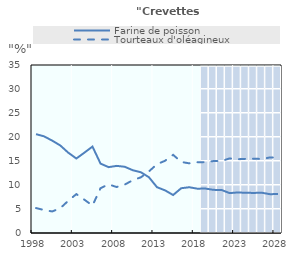
| Category | Projected1 | Projected2 | Projected3 | Projected4 | Projected5 | Projected6 | Projected7 |
|---|---|---|---|---|---|---|---|
| 1998.0 | 0 | 0 | 0 | 0 | 0 | 0 | 0 |
| 1999.0 | 0 | 0 | 0 | 0 | 0 | 0 | 0 |
| 2000.0 | 0 | 0 | 0 | 0 | 0 | 0 | 0 |
| 2001.0 | 0 | 0 | 0 | 0 | 0 | 0 | 0 |
| 2002.0 | 0 | 0 | 0 | 0 | 0 | 0 | 0 |
| 2003.0 | 0 | 0 | 0 | 0 | 0 | 0 | 0 |
| 2004.0 | 0 | 0 | 0 | 0 | 0 | 0 | 0 |
| 2005.0 | 0 | 0 | 0 | 0 | 0 | 0 | 0 |
| 2006.0 | 0 | 0 | 0 | 0 | 0 | 0 | 0 |
| 2007.0 | 0 | 0 | 0 | 0 | 0 | 0 | 0 |
| 2008.0 | 0 | 0 | 0 | 0 | 0 | 0 | 0 |
| 2009.0 | 0 | 0 | 0 | 0 | 0 | 0 | 0 |
| 2010.0 | 0 | 0 | 0 | 0 | 0 | 0 | 0 |
| 2011.0 | 0 | 0 | 0 | 0 | 0 | 0 | 0 |
| 2012.0 | 0 | 0 | 0 | 0 | 0 | 0 | 0 |
| 2013.0 | 0 | 0 | 0 | 0 | 0 | 0 | 0 |
| 2014.0 | 0 | 0 | 0 | 0 | 0 | 0 | 0 |
| 2015.0 | 0 | 0 | 0 | 0 | 0 | 0 | 0 |
| 2016.0 | 0 | 0 | 0 | 0 | 0 | 0 | 0 |
| 2017.0 | 0 | 0 | 0 | 0 | 0 | 0 | 0 |
| 2018.0 | 0 | 0 | 0 | 0 | 0 | 0 | 0 |
| 2019.0 | 1 | 1 | 1 | 1 | 1 | 1 | 0.95 |
| 2020.0 | 1 | 1 | 1 | 1 | 1 | 1 | 0.95 |
| 2021.0 | 1 | 1 | 1 | 1 | 1 | 1 | 0.95 |
| 2022.0 | 1 | 1 | 1 | 1 | 1 | 1 | 0.95 |
| 2023.0 | 1 | 1 | 1 | 1 | 1 | 1 | 0.95 |
| 2024.0 | 1 | 1 | 1 | 1 | 1 | 1 | 0.95 |
| 2025.0 | 1 | 1 | 1 | 1 | 1 | 1 | 0.95 |
| 2026.0 | 1 | 1 | 1 | 1 | 1 | 1 | 0.95 |
| 2027.0 | 1 | 1 | 1 | 1 | 1 | 1 | 0.95 |
| 2028.0 | 1 | 1 | 1 | 1 | 1 | 1 | 0.95 |